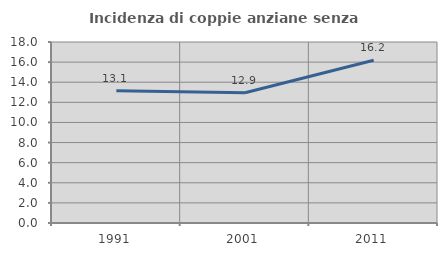
| Category | Incidenza di coppie anziane senza figli  |
|---|---|
| 1991.0 | 13.14 |
| 2001.0 | 12.946 |
| 2011.0 | 16.186 |